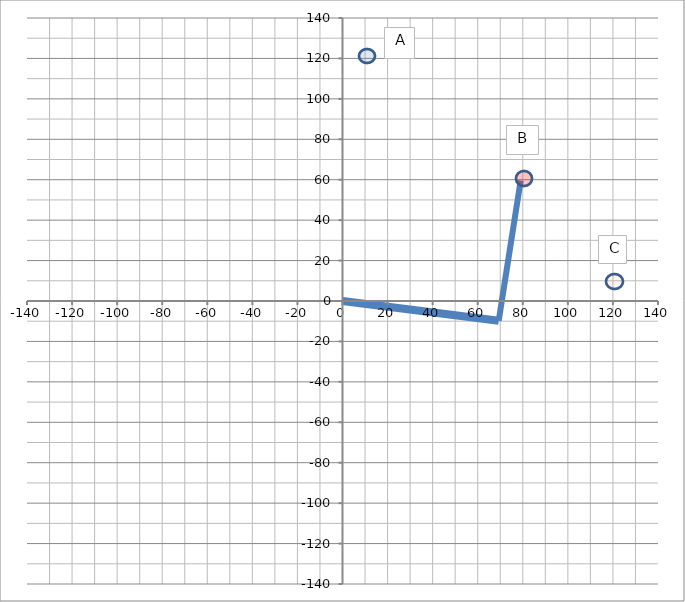
| Category | Series 0 |
|---|---|
| 0.0 | 0 |
| 69.31876481190993 | -9.742 |
| 79.0608818791145 | 59.577 |